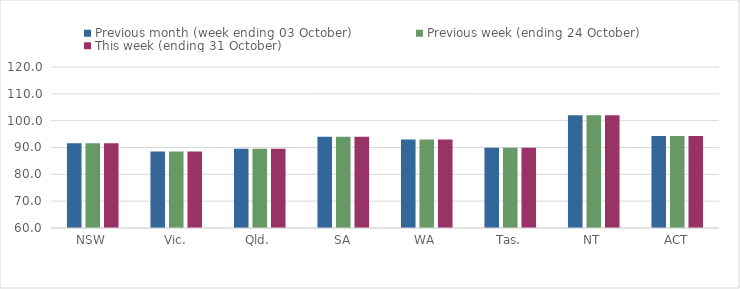
| Category | Previous month (week ending 03 October) | Previous week (ending 24 October) | This week (ending 31 October) |
|---|---|---|---|
| NSW | 91.58 | 91.58 | 91.58 |
| Vic. | 88.53 | 88.53 | 88.53 |
| Qld. | 89.57 | 89.57 | 89.57 |
| SA | 94.03 | 94.03 | 94.03 |
| WA | 92.97 | 92.97 | 92.97 |
| Tas. | 89.92 | 89.92 | 89.92 |
| NT | 102.06 | 102.06 | 102.06 |
| ACT | 94.25 | 94.25 | 94.25 |